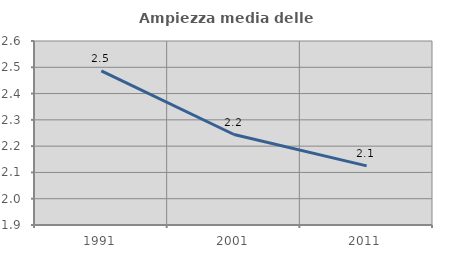
| Category | Ampiezza media delle famiglie |
|---|---|
| 1991.0 | 2.486 |
| 2001.0 | 2.244 |
| 2011.0 | 2.125 |